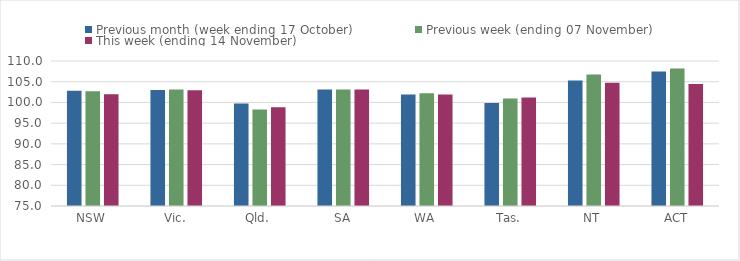
| Category | Previous month (week ending 17 October) | Previous week (ending 07 November) | This week (ending 14 November) |
|---|---|---|---|
| NSW | 102.8 | 102.67 | 101.99 |
| Vic. | 102.99 | 103.11 | 102.92 |
| Qld. | 99.72 | 98.28 | 98.84 |
| SA | 103.15 | 103.15 | 103.15 |
| WA | 101.9 | 102.19 | 101.92 |
| Tas. | 99.88 | 100.93 | 101.19 |
| NT | 105.28 | 106.75 | 104.74 |
| ACT | 107.44 | 108.18 | 104.44 |